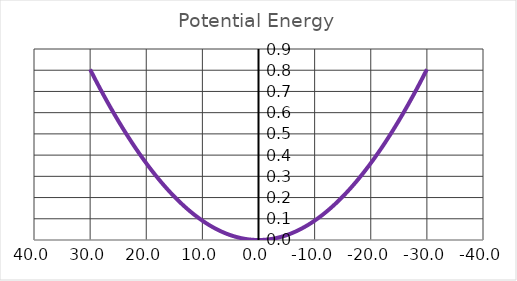
| Category | Series 0 |
|---|---|
| 30.000000000000007 | 0.804 |
| 29.969251271688933 | 0.802 |
| 29.907782401459603 | 0.799 |
| 29.815650562036044 | 0.794 |
| 29.692941512104007 | 0.788 |
| 29.539769595142385 | 0.78 |
| 29.35627773672376 | 0.77 |
| 29.142637439316722 | 0.76 |
| 28.899048773394565 | 0.747 |
| 28.625740363436094 | 0.733 |
| 28.322969367196393 | 0.718 |
| 27.99102144643041 | 0.702 |
| 27.630210727071546 | 0.684 |
| 27.240879746703506 | 0.665 |
| 26.823399387017524 | 0.646 |
| 26.378168788820858 | 0.625 |
| 25.905615247057472 | 0.603 |
| 25.406194083219766 | 0.58 |
| 24.88038849247254 | 0.557 |
| 24.328709362777982 | 0.533 |
| 23.751695063305238 | 0.508 |
| 23.14991119943004 | 0.483 |
| 22.52395033168065 | 0.458 |
| 21.874431656065944 | 0.432 |
| 21.202000643330283 | 0.406 |
| 20.507328634818098 | 0.38 |
| 19.791112392798354 | 0.354 |
| 19.054073603294707 | 0.329 |
| 18.296958329690703 | 0.303 |
| 17.520536415628868 | 0.278 |
| 16.725600835997156 | 0.254 |
| 15.91296699509357 | 0.23 |
| 15.083471971377783 | 0.207 |
| 14.237973708554568 | 0.184 |
| 13.377350153085015 | 0.163 |
| 12.50249833858459 | 0.142 |
| 11.61433341793859 | 0.123 |
| 10.713787644341881 | 0.105 |
| 9.801809302846978 | 0.088 |
| 8.879361594378679 | 0.072 |
| 7.947421474540327 | 0.058 |
| 7.006978449892392 | 0.045 |
| 6.059033334724281 | 0.034 |
| 5.104596971661064 | 0.024 |
| 4.144688919744449 | 0.016 |
| 3.1803361138980506 | 0.009 |
| 2.2125714999276704 | 0.004 |
| 1.2424326494146973 | 0.001 |
| 0.2709603590324336 | 0 |
| -0.7008027610511226 | 0 |
| -1.6718137049264628 | 0.003 |
| -2.641030490040946 | 0.006 |
| -3.6074135728199597 | 0.012 |
| -4.569927256018527 | 0.019 |
| -5.527541083082401 | 0.028 |
| -6.479231214909474 | 0.038 |
| -7.423981784553087 | 0.05 |
| -8.360786225596593 | 0.064 |
| -9.288648570151029 | 0.079 |
| -10.206584712682039 | 0.095 |
| -11.113623636155326 | 0.113 |
| -12.008808597298136 | 0.131 |
| -12.891198268104315 | 0.151 |
| -13.759867831057786 | 0.172 |
| -14.61391002591059 | 0.194 |
| -15.452436146222105 | 0.217 |
| -16.27457698424211 | 0.24 |
| -17.07948372309761 | 0.265 |
| -17.86632877561805 | 0.289 |
| -18.634306569501682 | 0.315 |
| -19.382634278884158 | 0.34 |
| -20.110552502715205 | 0.366 |
| -20.81732589067758 | 0.392 |
| -21.502243717691794 | 0.418 |
| -22.164620408337452 | 0.443 |
| -22.80379601278597 | 0.469 |
| -23.419136636077525 | 0.494 |
| -24.01003482278639 | 0.519 |
| -24.575909899302115 | 0.544 |
| -25.116208276108264 | 0.567 |
| -25.630403712565972 | 0.59 |
| -26.117997546805217 | 0.613 |
| -26.578518893393525 | 0.634 |
| -27.011524811489895 | 0.655 |
| -27.41660044620133 | 0.674 |
| -27.793359145842167 | 0.692 |
| -28.141442557752523 | 0.709 |
| -28.460520705263658 | 0.725 |
| -28.750292048305603 | 0.74 |
| -29.010483530037867 | 0.753 |
| -29.240850611748822 | 0.765 |
| -29.44117729811511 | 0.775 |
| -29.611276154740843 | 0.784 |
| -29.750988319709226 | 0.791 |
| -29.86018351067827 | 0.797 |
| -29.938760028839216 | 0.801 |
| -29.9866447608333 | 0.803 |
| -30.003793179490756 | 0.804 |